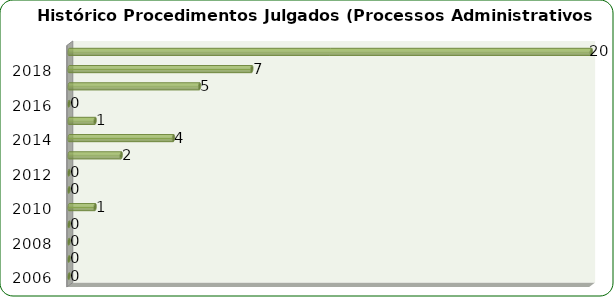
| Category | Total de Processos Administrativos Disciplinares |
|---|---|
| 2006 | 0 |
| 2007 | 0 |
| 2008 | 0 |
| 2009 | 0 |
| 2010 | 1 |
| 2011 | 0 |
| 2012 | 0 |
| 2013 | 2 |
| 2014 | 4 |
| 2015 | 1 |
| 2016 | 0 |
| 2017 | 5 |
| 2018 | 7 |
| Total | 20 |